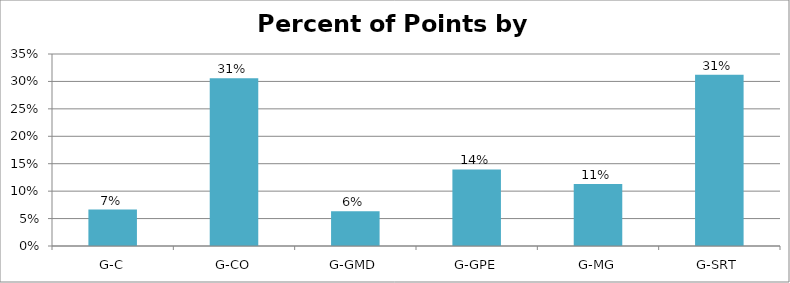
| Category | Percent |
|---|---|
| G-C | 0.066 |
| G-CO | 0.306 |
| G-GMD | 0.063 |
| G-GPE | 0.14 |
| G-MG | 0.113 |
| G-SRT | 0.312 |